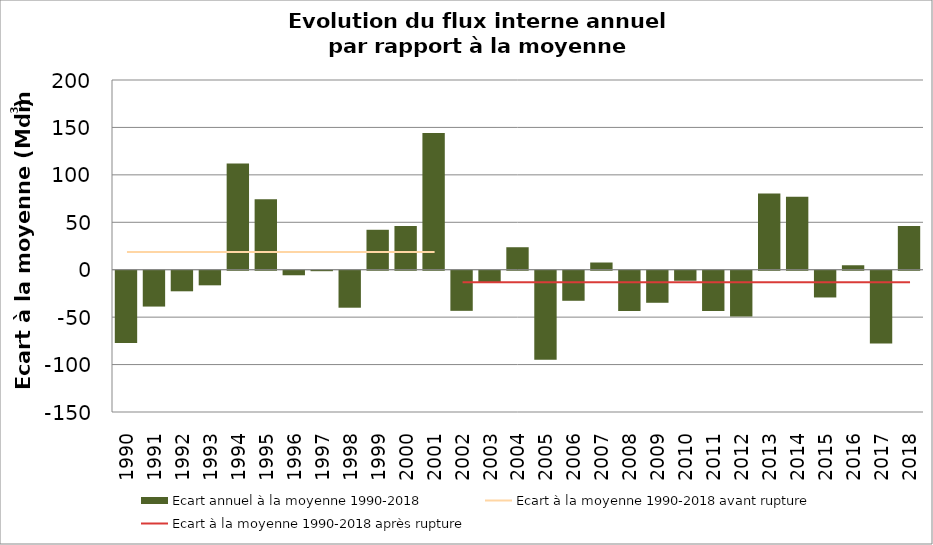
| Category | Ecart annuel à la moyenne 1990-2018 |
|---|---|
| 1990.0 | -76.3 |
| 1991.0 | -37.8 |
| 1992.0 | -21.7 |
| 1993.0 | -15.4 |
| 1994.0 | 112.1 |
| 1995.0 | 74.4 |
| 1996.0 | -4.8 |
| 1997.0 | -0.5 |
| 1998.0 | -39 |
| 1999.0 | 42.1 |
| 2000.0 | 46 |
| 2001.0 | 144.1 |
| 2002.0 | -42.3 |
| 2003.0 | -12.1 |
| 2004.0 | 23.7 |
| 2005.0 | -93.9 |
| 2006.0 | -31.7 |
| 2007.0 | 7.6 |
| 2008.0 | -42.6 |
| 2009.0 | -33.8 |
| 2010.0 | -10.6 |
| 2011.0 | -42.5 |
| 2012.0 | -48.3 |
| 2013.0 | 80.4 |
| 2014.0 | 77 |
| 2015.0 | -28.2 |
| 2016.0 | 4.7 |
| 2017.0 | -76.8 |
| 2018.0 | 46.1 |